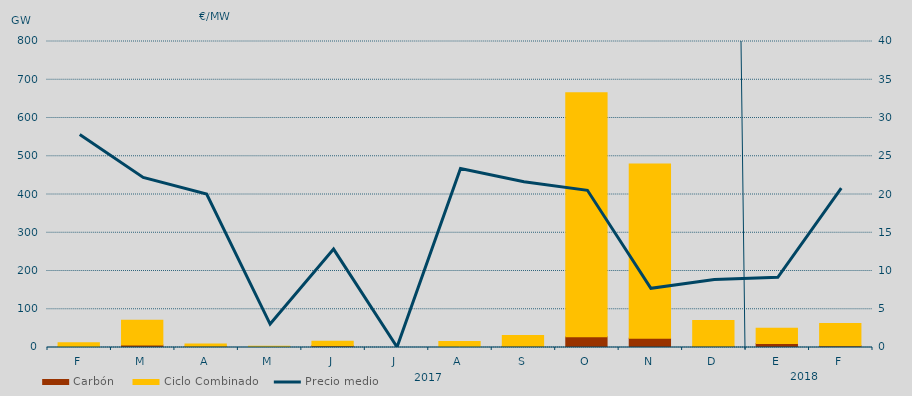
| Category | Carbón | Ciclo Combinado |
|---|---|---|
| F | 1383.6 | 10714 |
| M | 6612.9 | 64802.4 |
| A | 3055 | 6101.5 |
| M | 341 | 2659 |
| J | 4305 | 11713 |
| J | 0 | 0 |
| A | 0 | 15430.5 |
| S | 3306.6 | 27967.5 |
| O | 27914.4 | 638167.2 |
| N | 23926.9 | 455734.5 |
| D | 3200.6 | 67420.5 |
| E | 10696.2 | 39454.7 |
| F | 4341.9 | 58215.4 |